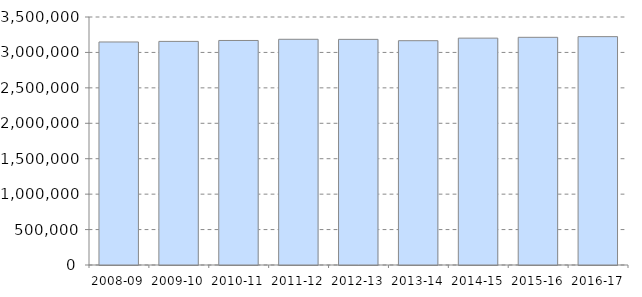
| Category | List size |
|---|---|
| 2008-09 | 3147550 |
| 2009-10 | 3155692 |
| 2010-11 | 3168721 |
| 2011-12 | 3185538 |
| 2012-13 | 3184260 |
| 2013-14 | 3165517 |
| 2014-15 | 3201691 |
| 2015-16 | 3213140 |
| 2016-17 | 3222892 |